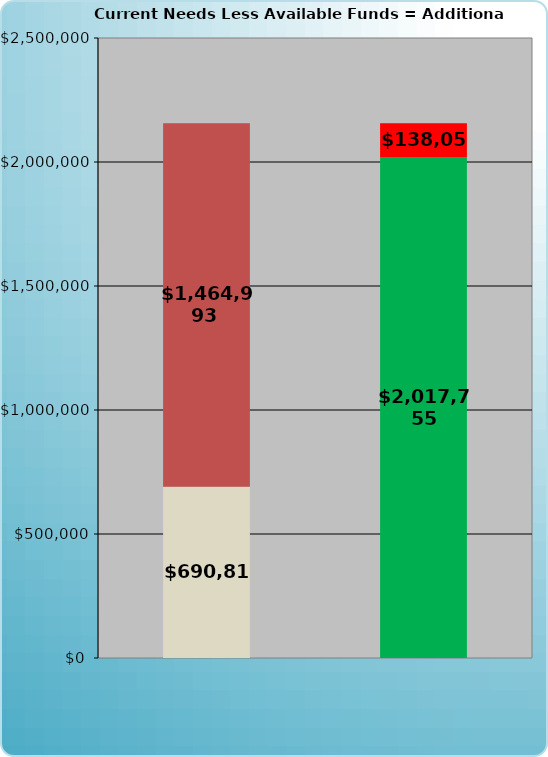
| Category | Series 0 | Series 1 |
|---|---|---|
| 0 | 690818.72 | 1464993.254 |
| 1 | 2017755 | 138056.974 |